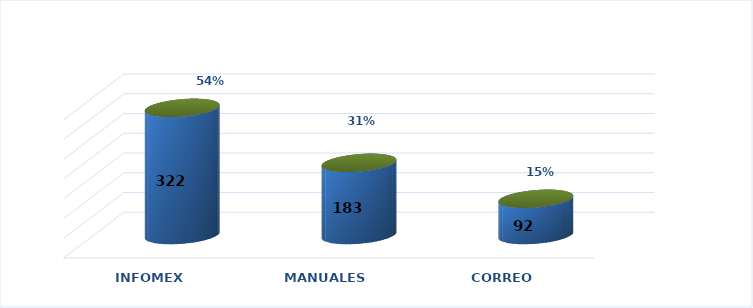
| Category | Series 0 | Series 1 |
|---|---|---|
| INFOMEX | 322 | 0.539 |
| MANUALES | 183 | 0.307 |
| CORREO | 92 | 0.154 |